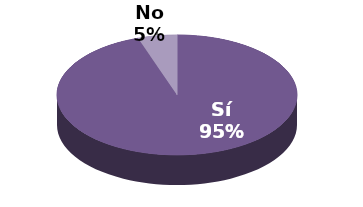
| Category | Series 1 |
|---|---|
| Sí | 18 |
| No | 1 |